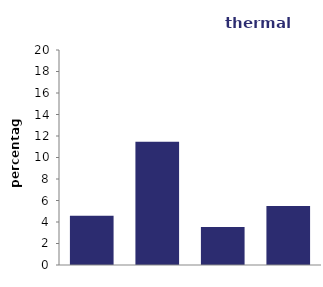
| Category | thermal comfort |
|---|---|
| owner 
occupied | 4.572 |
| private 
rented | 11.468 |
| local 
authority | 3.536 |
| housing 
association | 5.487 |